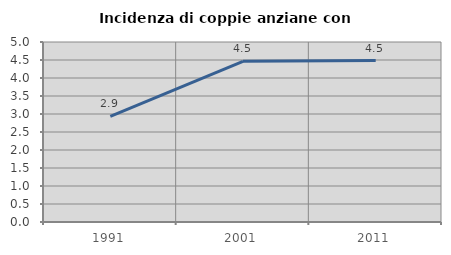
| Category | Incidenza di coppie anziane con figli |
|---|---|
| 1991.0 | 2.937 |
| 2001.0 | 4.463 |
| 2011.0 | 4.483 |